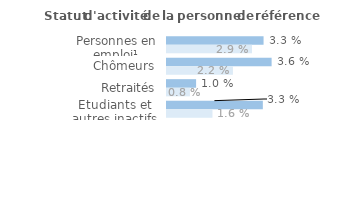
| Category | Series 1 | Series 0 |
|---|---|---|
| Personnes en emploi¹ | 0.033 | 0.029 |
| Chômeurs | 0.036 | 0.022 |
| Retraités | 0.01 | 0.008 |
| Etudiants et autres inactifs | 0.033 | 0.016 |